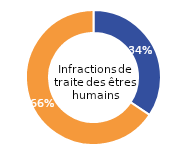
| Category | Femmes |
|---|---|
| Femmes | 34.37 |
| Hommes | 65.63 |